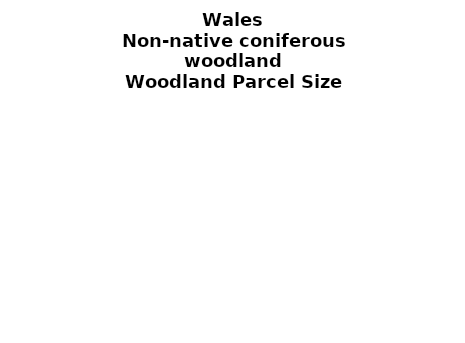
| Category | Non-native coniferous woodland |
|---|---|
| <5 ha | 0.033 |
| ≥5 and <10 ha | 0.015 |
| ≥10 and <15 ha | 0.018 |
| ≥15 and <20 ha | 0.013 |
| ≥20 and <25 ha | 0.016 |
| ≥25 and <30 ha | 0.01 |
| ≥30 and <35 ha | 0.009 |
| ≥35 and <40 ha | 0.012 |
| ≥40 and <45 ha | 0.007 |
| ≥45 and <50 ha | 0.006 |
| ≥50 and <60 ha | 0.019 |
| ≥60 and <70 ha | 0.007 |
| ≥70 and <80 ha | 0.017 |
| ≥80 and <90 ha | 0.018 |
| ≥90 and <100 ha | 0.016 |
| ≥100 and <150 ha | 0.057 |
| ≥150 and <200 ha | 0.037 |
| ≥200 ha | 0.69 |